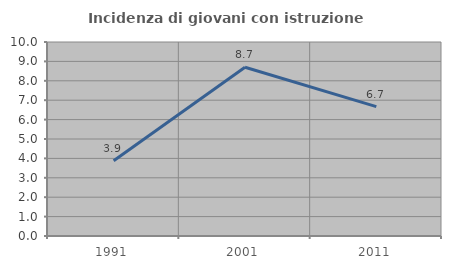
| Category | Incidenza di giovani con istruzione universitaria |
|---|---|
| 1991.0 | 3.883 |
| 2001.0 | 8.696 |
| 2011.0 | 6.667 |